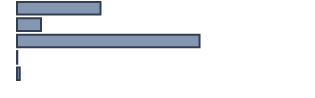
| Category | Percentatge |
|---|---|
| 0 | 28.5 |
| 1 | 8.2 |
| 2 | 62.3 |
| 3 | 0.1 |
| 4 | 0.9 |